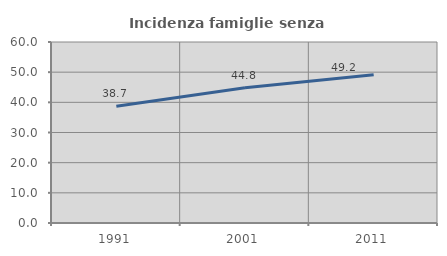
| Category | Incidenza famiglie senza nuclei |
|---|---|
| 1991.0 | 38.666 |
| 2001.0 | 44.828 |
| 2011.0 | 49.176 |